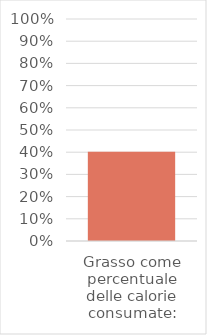
| Category | Series 0 |
|---|---|
| Grasso come percentuale delle calorie consumate: | 0.402 |